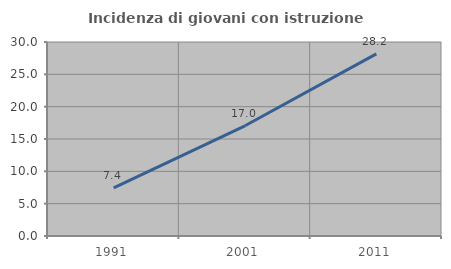
| Category | Incidenza di giovani con istruzione universitaria |
|---|---|
| 1991.0 | 7.43 |
| 2001.0 | 17.044 |
| 2011.0 | 28.154 |